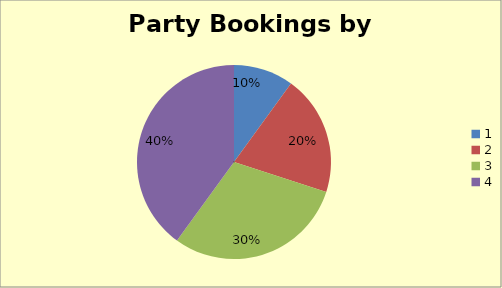
| Category | Party Type | Totals |
|---|---|---|
| 0 | 1 | 116 |
| 1 | 2 | 164 |
| 2 | 3 | 143 |
| 3 | 4 | 179 |